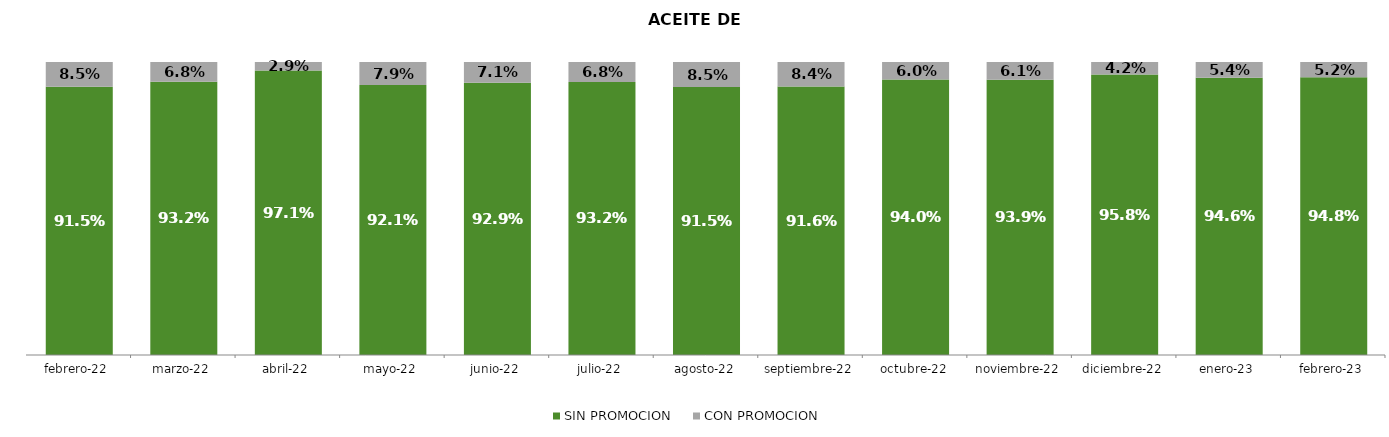
| Category | SIN PROMOCION   | CON PROMOCION   |
|---|---|---|
| 2022-02-01 | 0.915 | 0.085 |
| 2022-03-01 | 0.932 | 0.068 |
| 2022-04-01 | 0.971 | 0.029 |
| 2022-05-01 | 0.921 | 0.079 |
| 2022-06-01 | 0.929 | 0.071 |
| 2022-07-01 | 0.932 | 0.068 |
| 2022-08-01 | 0.915 | 0.085 |
| 2022-09-01 | 0.916 | 0.084 |
| 2022-10-01 | 0.94 | 0.06 |
| 2022-11-01 | 0.939 | 0.061 |
| 2022-12-01 | 0.958 | 0.042 |
| 2023-01-01 | 0.946 | 0.054 |
| 2023-02-01 | 0.948 | 0.052 |